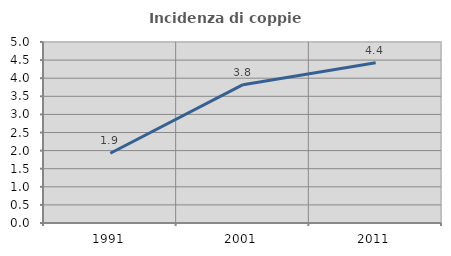
| Category | Incidenza di coppie miste |
|---|---|
| 1991.0 | 1.926 |
| 2001.0 | 3.821 |
| 2011.0 | 4.427 |